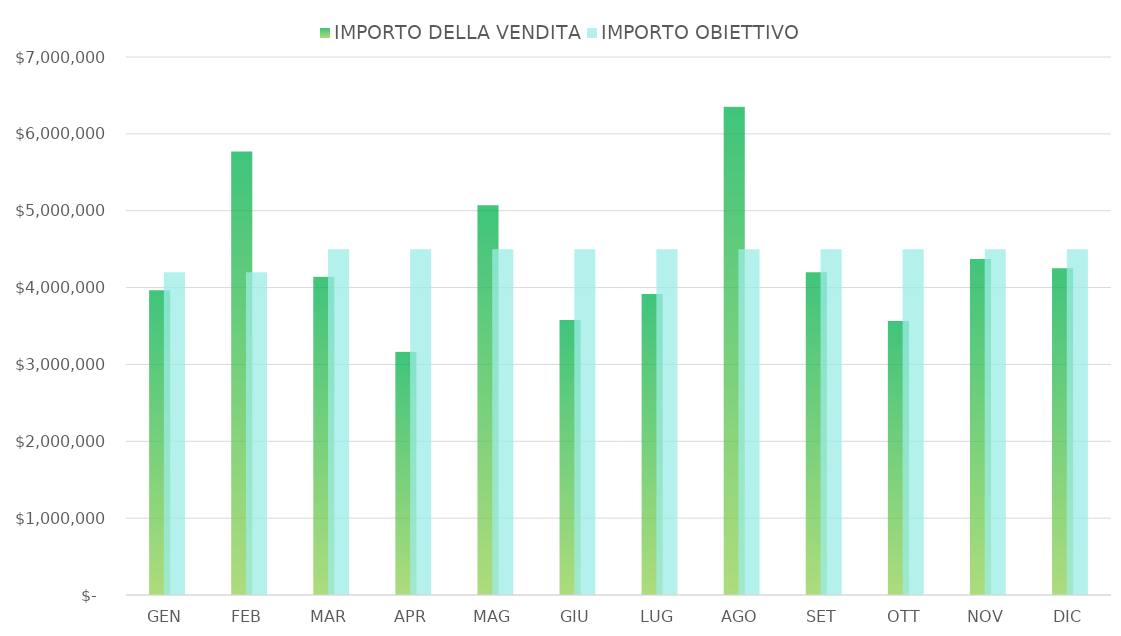
| Category | IMPORTO DELLA VENDITA | IMPORTO OBIETTIVO |
|---|---|---|
| GEN | 3964785 | 4200000 |
| FEB | 5772041 | 4200000 |
| MAR | 4139699 | 4500000 |
| APR | 3166287 | 4500000 |
| MAG | 5072530 | 4500000 |
| GIU | 3577330 | 4500000 |
| LUG | 3916803 | 4500000 |
| AGO | 6352355 | 4500000 |
| SET | 4198802 | 4500000 |
| OTT | 3563537 | 4500000 |
| NOV | 4373343 | 4500000 |
| DIC | 4250199 | 4500000 |